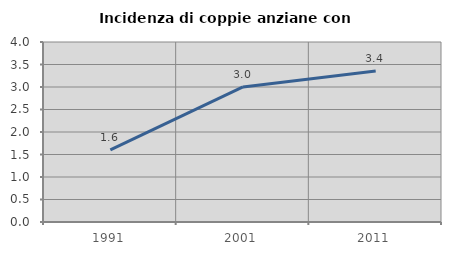
| Category | Incidenza di coppie anziane con figli |
|---|---|
| 1991.0 | 1.602 |
| 2001.0 | 3.001 |
| 2011.0 | 3.356 |